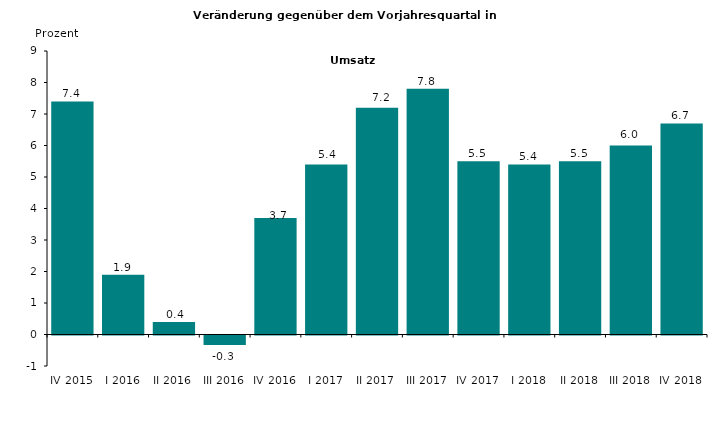
| Category | Series 0 |
|---|---|
| IV 2015 | 7.4 |
| I 2016 | 1.9 |
| II 2016 | 0.4 |
| III 2016 | -0.3 |
| IV 2016 | 3.7 |
| I 2017 | 5.4 |
| II 2017 | 7.2 |
| III 2017 | 7.8 |
| IV 2017 | 5.5 |
| I 2018 | 5.4 |
| II 2018 | 5.5 |
| III 2018 | 6 |
| IV 2018 | 6.7 |